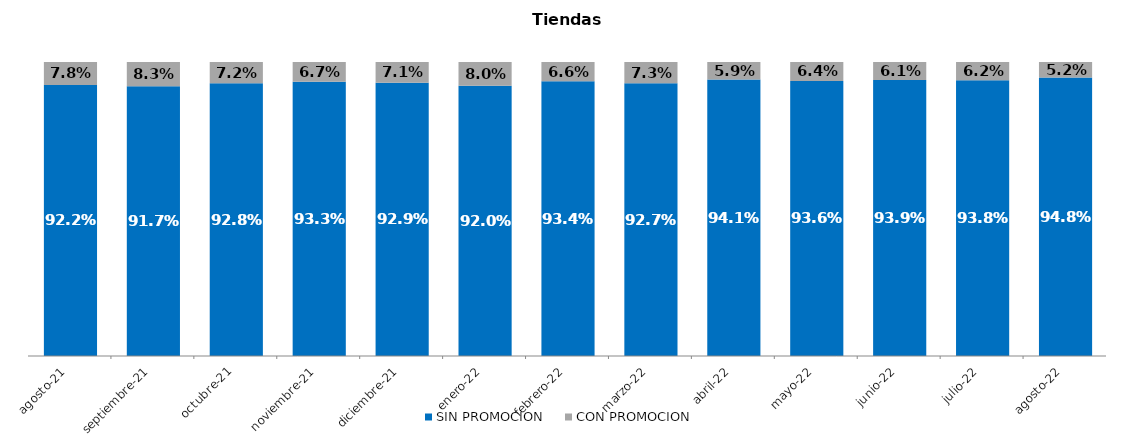
| Category | SIN PROMOCION   | CON PROMOCION   |
|---|---|---|
| 2021-08-01 | 0.922 | 0.078 |
| 2021-09-01 | 0.917 | 0.083 |
| 2021-10-01 | 0.928 | 0.072 |
| 2021-11-01 | 0.933 | 0.067 |
| 2021-12-01 | 0.929 | 0.071 |
| 2022-01-01 | 0.92 | 0.08 |
| 2022-02-01 | 0.934 | 0.066 |
| 2022-03-01 | 0.927 | 0.073 |
| 2022-04-01 | 0.941 | 0.059 |
| 2022-05-01 | 0.936 | 0.064 |
| 2022-06-01 | 0.939 | 0.061 |
| 2022-07-01 | 0.938 | 0.062 |
| 2022-08-01 | 0.948 | 0.052 |